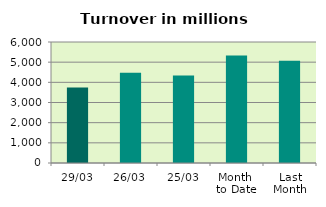
| Category | Series 0 |
|---|---|
| 29/03 | 3745.956 |
| 26/03 | 4471.761 |
| 25/03 | 4343.955 |
| Month 
to Date | 5324.414 |
| Last
Month | 5069.383 |